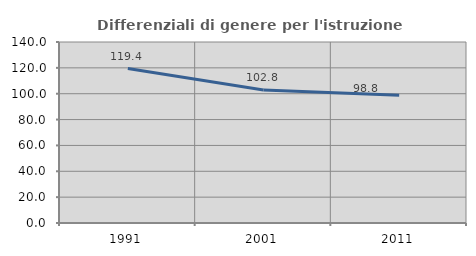
| Category | Differenziali di genere per l'istruzione superiore |
|---|---|
| 1991.0 | 119.447 |
| 2001.0 | 102.829 |
| 2011.0 | 98.847 |